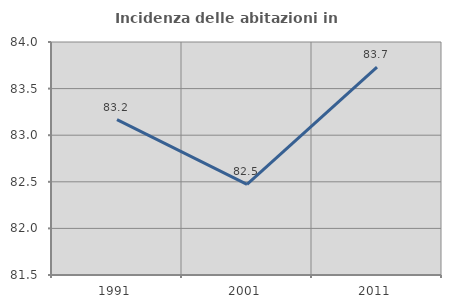
| Category | Incidenza delle abitazioni in proprietà  |
|---|---|
| 1991.0 | 83.167 |
| 2001.0 | 82.473 |
| 2011.0 | 83.73 |